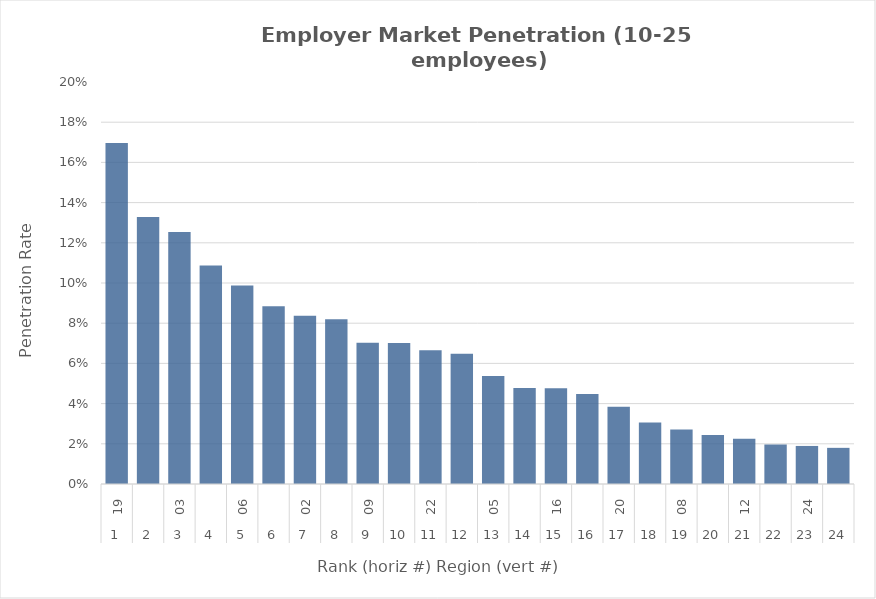
| Category | Rate |
|---|---|
| 0 | 0.17 |
| 1 | 0.133 |
| 2 | 0.125 |
| 3 | 0.109 |
| 4 | 0.099 |
| 5 | 0.088 |
| 6 | 0.084 |
| 7 | 0.082 |
| 8 | 0.07 |
| 9 | 0.07 |
| 10 | 0.067 |
| 11 | 0.065 |
| 12 | 0.054 |
| 13 | 0.048 |
| 14 | 0.048 |
| 15 | 0.045 |
| 16 | 0.038 |
| 17 | 0.031 |
| 18 | 0.027 |
| 19 | 0.024 |
| 20 | 0.023 |
| 21 | 0.02 |
| 22 | 0.019 |
| 23 | 0.018 |